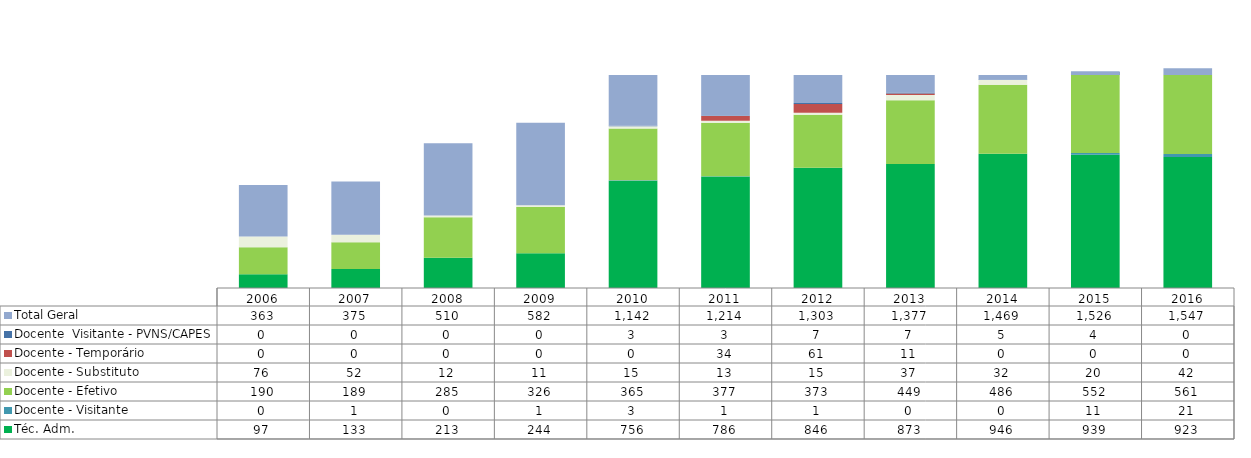
| Category | Téc. Adm. | Docente - Visitante | Docente - Efetivo | Docente - Substituto | Docente - Temporário | Docente  Visitante - PVNS/CAPES  | Total Geral |
|---|---|---|---|---|---|---|---|
| 2006.0 | 97 | 0 | 190 | 76 | 0 | 0 | 363 |
| 2007.0 | 133 | 1 | 189 | 52 | 0 | 0 | 375 |
| 2008.0 | 213 | 0 | 285 | 12 | 0 | 0 | 510 |
| 2009.0 | 244 | 1 | 326 | 11 | 0 | 0 | 582 |
| 2010.0 | 756 | 3 | 365 | 15 | 0 | 3 | 1142 |
| 2011.0 | 786 | 1 | 377 | 13 | 34 | 3 | 1214 |
| 2012.0 | 846 | 1 | 373 | 15 | 61 | 7 | 1303 |
| 2013.0 | 873 | 0 | 449 | 37 | 11 | 7 | 1377 |
| 2014.0 | 946 | 0 | 486 | 32 | 0 | 5 | 1469 |
| 2015.0 | 939 | 11 | 552 | 20 | 0 | 4 | 1526 |
| 2016.0 | 923 | 21 | 561 | 42 | 0 | 0 | 1547 |